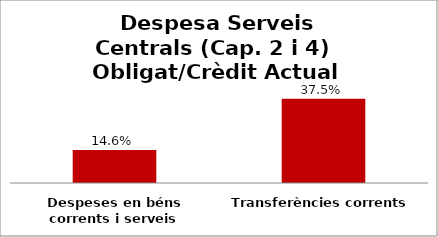
| Category | Series 0 |
|---|---|
| Despeses en béns corrents i serveis | 0.146 |
| Transferències corrents | 0.375 |